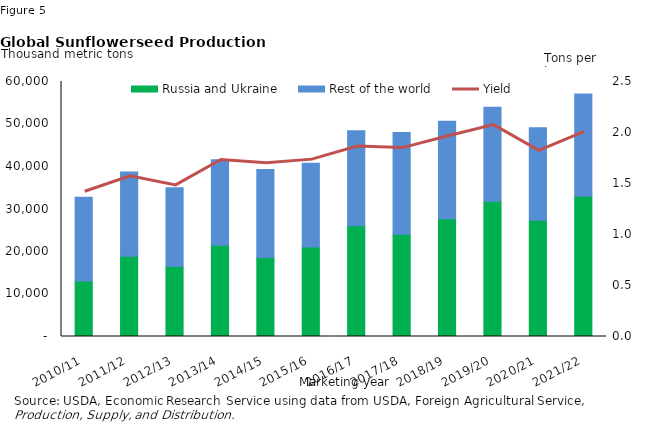
| Category | Russia and Ukraine | Rest of the world |
|---|---|---|
| 2010/11 | 13079 | 19704 |
| 2011/12 | 18862 | 19871 |
| 2012/13 | 16495 | 18477 |
| 2013/14 | 21442 | 20126 |
| 2014/15 | 18574 | 20710 |
| 2015/16 | 21073 | 19677 |
| 2016/17 | 26058 | 22335 |
| 2017/18 | 24062 | 23948 |
| 2018/19 | 27710 | 22949 |
| 2019/20 | 31805 | 22132 |
| 2020/21 | 27369 | 21738 |
| 2021/22 | 33000 | 24041 |